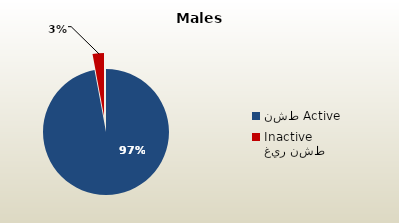
| Category | الذكور غير القطريين  Non-Qatari Males |
|---|---|
| نشط Active | 1570306 |
| غير نشط Inactive | 47189 |